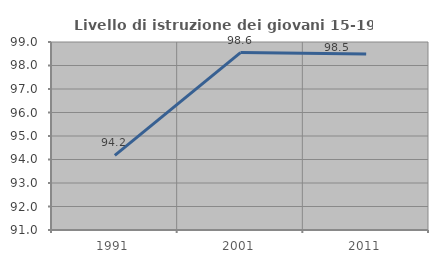
| Category | Livello di istruzione dei giovani 15-19 anni |
|---|---|
| 1991.0 | 94.175 |
| 2001.0 | 98.551 |
| 2011.0 | 98.485 |